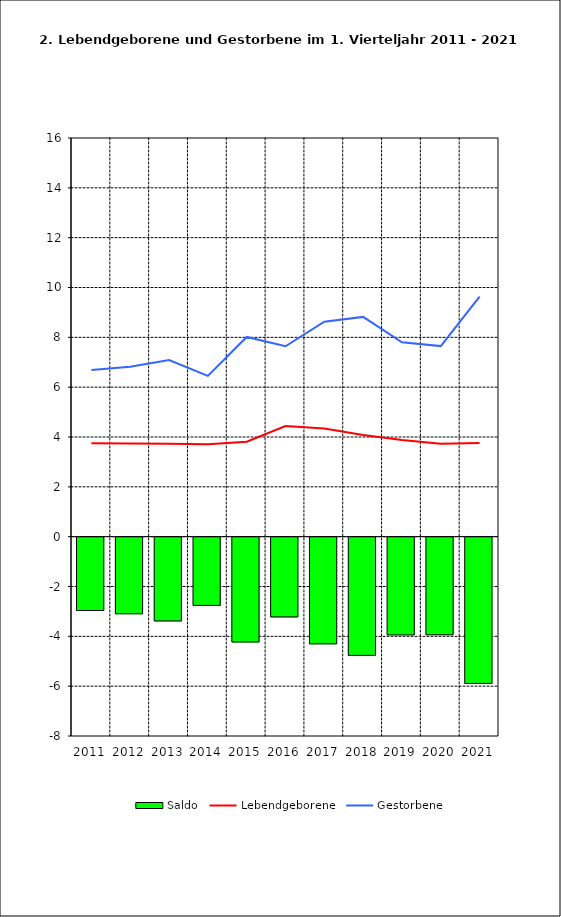
| Category | Saldo |
|---|---|
| 2011.0 | -2.944 |
| 2012.0 | -3.075 |
| 2013.0 | -3.361 |
| 2014.0 | -2.739 |
| 2015.0 | -4.206 |
| 2016.0 | -3.2 |
| 2017.0 | -4.282 |
| 2018.0 | -4.744 |
| 2019.0 | -3.921 |
| 2020.0 | -3.916 |
| 2021.0 | -5.87 |